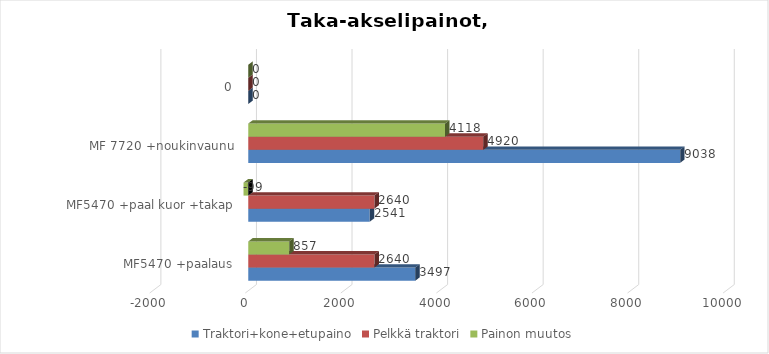
| Category | Traktori+kone+etupaino | Pelkkä traktori | Painon muutos |
|---|---|---|---|
| MF5470 +paalaus | 3497.303 | 2640 | 857.303 |
| MF5470 +paal kuor +takap | 2540.749 | 2640 | -99.251 |
| MF 7720 +noukinvaunu | 9038.243 | 4920 | 4118.243 |
| 0 | 0 | 0 | 0 |